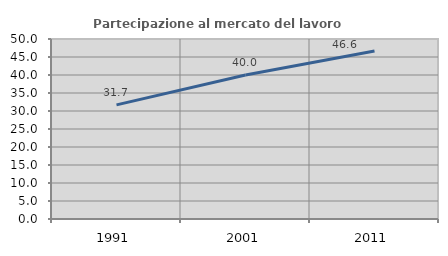
| Category | Partecipazione al mercato del lavoro  femminile |
|---|---|
| 1991.0 | 31.694 |
| 2001.0 | 40 |
| 2011.0 | 46.64 |